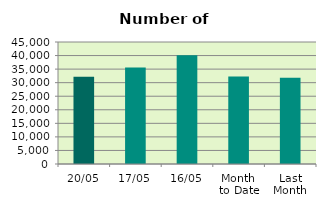
| Category | Series 0 |
|---|---|
| 20/05 | 32150 |
| 17/05 | 35596 |
| 16/05 | 40108 |
| Month 
to Date | 32314.308 |
| Last
Month | 31788.9 |